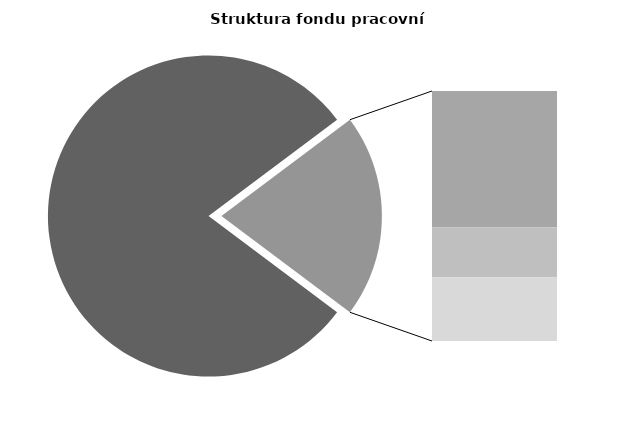
| Category | Series 0 |
|---|---|
| Průměrná měsíční odpracovaná doba bez přesčasu | 136.325 |
| Dovolená | 19.154 |
| Nemoc | 6.989 |
| Jiné | 8.94 |